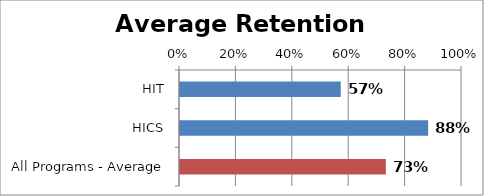
| Category | RetentionRate |
|---|---|
| HIT | 0.57 |
| HICS | 0.88 |
| All Programs - Average | 0.73 |